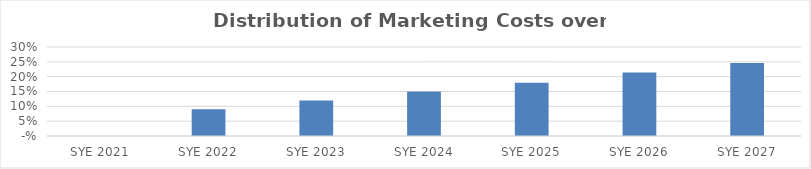
| Category | Series 0 |
|---|---|
| 2021.0 | 0 |
| 2022.0 | 0.09 |
| 2023.0 | 0.12 |
| 2024.0 | 0.15 |
| 2025.0 | 0.18 |
| 2026.0 | 0.214 |
| 2027.0 | 0.246 |